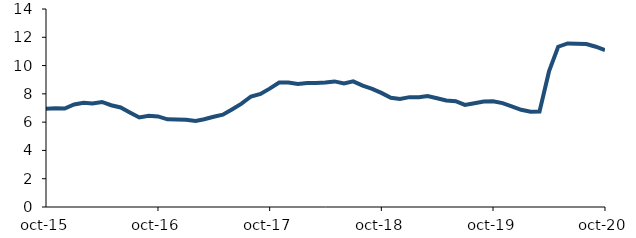
| Category | Series 0 |
|---|---|
| 2015-10-01 | 6.94 |
| 2015-11-01 | 6.986 |
| 2015-12-01 | 6.966 |
| 2016-01-01 | 7.247 |
| 2016-02-01 | 7.368 |
| 2016-03-01 | 7.315 |
| 2016-04-01 | 7.425 |
| 2016-05-01 | 7.195 |
| 2016-06-01 | 7.04 |
| 2016-07-01 | 6.69 |
| 2016-08-01 | 6.328 |
| 2016-09-01 | 6.45 |
| 2016-10-01 | 6.406 |
| 2016-11-01 | 6.196 |
| 2016-12-01 | 6.192 |
| 2017-01-01 | 6.165 |
| 2017-02-01 | 6.08 |
| 2017-03-01 | 6.203 |
| 2017-04-01 | 6.378 |
| 2017-05-01 | 6.527 |
| 2017-06-01 | 6.918 |
| 2017-07-01 | 7.307 |
| 2017-08-01 | 7.812 |
| 2017-09-01 | 7.996 |
| 2017-10-01 | 8.37 |
| 2017-11-01 | 8.797 |
| 2017-12-01 | 8.796 |
| 2018-01-01 | 8.705 |
| 2018-02-01 | 8.764 |
| 2018-03-01 | 8.769 |
| 2018-04-01 | 8.806 |
| 2018-05-01 | 8.88 |
| 2018-06-01 | 8.736 |
| 2018-07-01 | 8.885 |
| 2018-08-01 | 8.583 |
| 2018-09-01 | 8.356 |
| 2018-10-01 | 8.067 |
| 2018-11-01 | 7.725 |
| 2018-12-01 | 7.64 |
| 2019-01-01 | 7.767 |
| 2019-02-01 | 7.758 |
| 2019-03-01 | 7.847 |
| 2019-04-01 | 7.692 |
| 2019-05-01 | 7.533 |
| 2019-06-01 | 7.478 |
| 2019-07-01 | 7.214 |
| 2019-08-01 | 7.334 |
| 2019-09-01 | 7.453 |
| 2019-10-01 | 7.48 |
| 2019-11-01 | 7.348 |
| 2019-12-01 | 7.12 |
| 2020-01-01 | 6.874 |
| 2020-02-01 | 6.737 |
| 2020-03-01 | 6.758 |
| 2020-04-01 | 9.586 |
| 2020-05-01 | 11.333 |
| 2020-06-01 | 11.565 |
| 2020-07-01 | 11.551 |
| 2020-08-01 | 11.519 |
| 2020-09-01 | 11.333 |
| 2020-10-01 | 11.095 |